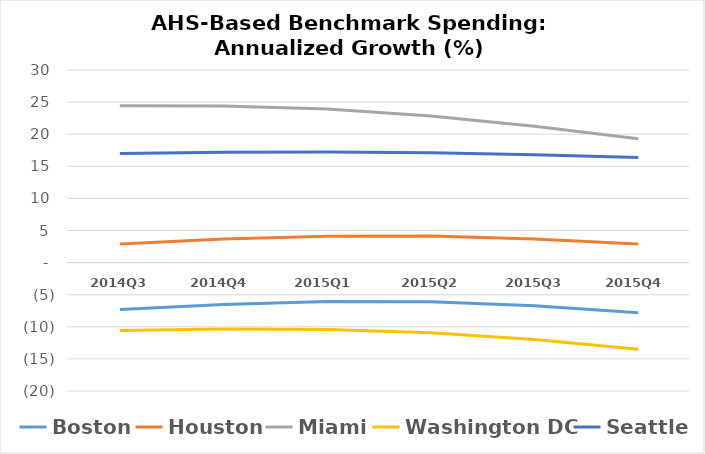
| Category | Boston | Houston | Miami | Washington DC | Seattle |
|---|---|---|---|---|---|
| 2014Q3 | -7.289 | 2.892 | 24.419 | -10.584 | 16.976 |
| 2014Q4 | -6.514 | 3.659 | 24.408 | -10.353 | 17.187 |
| 2015Q1 | -6.063 | 4.113 | 23.921 | -10.42 | 17.246 |
| 2015Q2 | -6.113 | 4.127 | 22.842 | -10.945 | 17.115 |
| 2015Q3 | -6.72 | 3.69 | 21.237 | -11.992 | 16.806 |
| 2015Q4 | -7.809 | 2.895 | 19.304 | -13.512 | 16.373 |